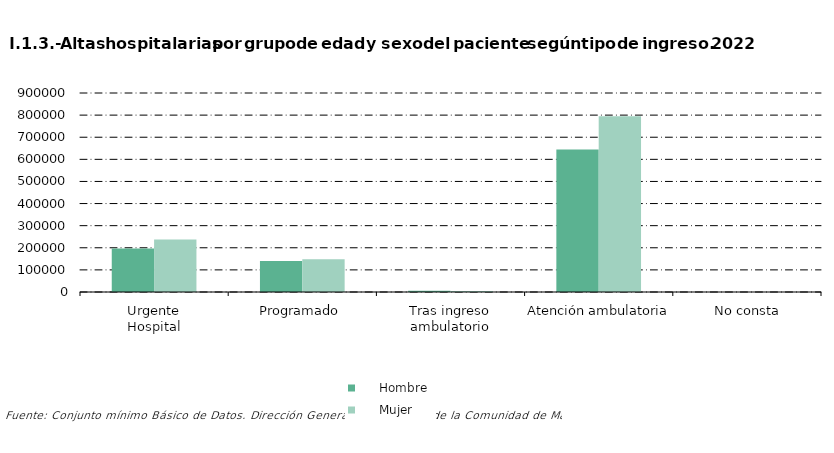
| Category |      Hombre |      Mujer |
|---|---|---|
| 0 | 196872 | 237170 |
| 1 | 140056 | 148065 |
| 2 | 5207 | 5030 |
| 3 | 644387 | 795391 |
| 4 | 221 | 190 |